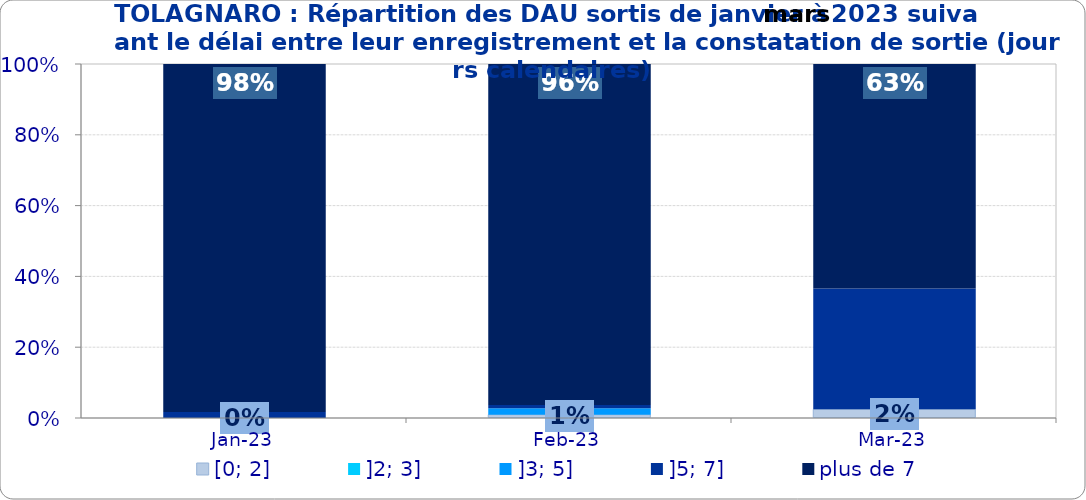
| Category | [0; 2] | ]2; 3] | ]3; 5] | ]5; 7] | plus de 7 |
|---|---|---|---|---|---|
| 2023-01-01 | 0 | 0 | 0 | 0.017 | 0.983 |
| 2023-02-01 | 0.009 | 0 | 0.019 | 0.009 | 0.963 |
| 2023-03-01 | 0.024 | 0 | 0 | 0.341 | 0.634 |